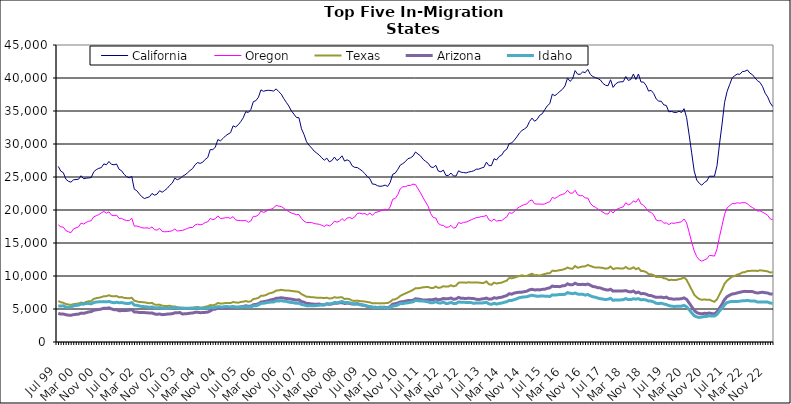
| Category | California | Oregon | Texas | Arizona | Idaho |
|---|---|---|---|---|---|
| Jul 99 | 26605 | 17749 | 6209 | 4339 | 5471 |
| Aug 99 | 25882 | 17447 | 6022 | 4228 | 5444 |
| Sep 99 | 25644 | 17401 | 5941 | 4237 | 5488 |
| Oct 99 | 24669 | 16875 | 5751 | 4134 | 5279 |
| Nov 99 | 24353 | 16701 | 5680 | 4073 | 5260 |
| Dec 99 | 24218 | 16570 | 5619 | 4042 | 5269 |
| Jan 00 | 24574 | 17109 | 5736 | 4142 | 5485 |
| Feb 00 | 24620 | 17295 | 5789 | 4192 | 5530 |
| Mar 00 | 24655 | 17436 | 5826 | 4226 | 5590 |
| Apr 00 | 25195 | 18009 | 5980 | 4375 | 5748 |
| May 00 | 24730 | 17875 | 5897 | 4337 | 5729 |
| Jun 00 | 24825 | 18113 | 6070 | 4444 | 5853 |
| Jul 00 | 24857 | 18294 | 6163 | 4555 | 5824 |
| Aug 00 | 24913 | 18376 | 6199 | 4603 | 5788 |
| Sep 00 | 25792 | 18971 | 6529 | 4804 | 5976 |
| Oct 00 | 26106 | 19135 | 6643 | 4870 | 6058 |
| Nov 00 | 26315 | 19306 | 6705 | 4926 | 6085 |
| Dec 00 | 26415 | 19570 | 6793 | 4991 | 6096 |
| Jan 01 | 26995 | 19781 | 6942 | 5122 | 6119 |
| Feb 01 | 26851 | 19519 | 6948 | 5089 | 6090 |
| Mar 01 | 27352 | 19720 | 7080 | 5180 | 6143 |
| Apr 01 | 26918 | 19221 | 6943 | 5020 | 6020 |
| May 01 | 26848 | 19126 | 6924 | 4899 | 5950 |
| Jun 01 | 26974 | 19241 | 6959 | 4895 | 6019 |
| Jul 01 | 26172 | 18725 | 6778 | 4737 | 5951 |
| Aug 01 | 25943 | 18736 | 6810 | 4757 | 5973 |
| Sep 01 | 25399 | 18514 | 6688 | 4753 | 5895 |
| Oct 01 | 25050 | 18415 | 6650 | 4780 | 5833 |
| Nov 01 | 24873 | 18381 | 6631 | 4826 | 5850 |
| Dec 01 | 25099 | 18765 | 6708 | 4898 | 5969 |
| Jan 02 | 23158 | 17561 | 6261 | 4560 | 5595 |
| Feb 02 | 22926 | 17573 | 6162 | 4531 | 5560 |
| Mar 02 | 22433 | 17452 | 6052 | 4481 | 5458 |
| Apr 02 | 22012 | 17314 | 6046 | 4458 | 5380 |
| May 02 | 21733 | 17267 | 6007 | 4452 | 5358 |
| Jun 02 | 21876 | 17298 | 5933 | 4444 | 5315 |
| Jul 02 | 21997 | 17209 | 5873 | 4383 | 5243 |
| Aug 02 | 22507 | 17436 | 5929 | 4407 | 5315 |
| Sep 02 | 22244 | 17010 | 5672 | 4248 | 5192 |
| Oct 02 | 22406 | 16952 | 5625 | 4191 | 5167 |
| Nov 02 | 22922 | 17223 | 5663 | 4242 | 5221 |
| Dec 02 | 22693 | 16770 | 5499 | 4142 | 5120 |
| Jan 03 | 22964 | 16694 | 5463 | 4166 | 5089 |
| Feb 03 | 23276 | 16727 | 5461 | 4226 | 5077 |
| Mar 03 | 23736 | 16766 | 5486 | 4251 | 5145 |
| Apr 03 | 24079 | 16859 | 5389 | 4289 | 5145 |
| May 03 | 24821 | 17117 | 5378 | 4415 | 5254 |
| Jun 03 | 24592 | 16812 | 5273 | 4426 | 5135 |
| Jul 03 | 24754 | 16875 | 5226 | 4466 | 5124 |
| Aug 03 | 25092 | 16922 | 5181 | 4244 | 5100 |
| Sep 03 | 25316 | 17036 | 5181 | 4279 | 5086 |
| Oct 03 | 25622 | 17228 | 5139 | 4301 | 5110 |
| Nov 03 | 25984 | 17335 | 5175 | 4362 | 5091 |
| Dec 03 | 26269 | 17350 | 5189 | 4396 | 5113 |
| Jan 04 | 26852 | 17734 | 5255 | 4492 | 5152 |
| Feb 04 | 27184 | 17860 | 5301 | 4502 | 5183 |
| Mar 04 | 27062 | 17757 | 5227 | 4443 | 5056 |
| Apr 04 | 27238 | 17840 | 5227 | 4461 | 5104 |
| May 04 | 27671 | 18113 | 5345 | 4493 | 5095 |
| Jun 04 | 27949 | 18201 | 5416 | 4532 | 5103 |
| Jul 04 | 29172 | 18727 | 5597 | 4697 | 5231 |
| Aug 04 | 29122 | 18529 | 5561 | 4945 | 5197 |
| Sep 04 | 29542 | 18678 | 5656 | 4976 | 5237 |
| Oct 04 | 30674 | 19108 | 5922 | 5188 | 5363 |
| Nov 04 | 30472 | 18716 | 5823 | 5106 | 5321 |
| Dec 04 | 30831 | 18755 | 5838 | 5135 | 5312 |
| Jan 05 | 31224 | 18823 | 5906 | 5155 | 5374 |
| Feb 05 | 31495 | 18842 | 5898 | 5168 | 5357 |
| Mar 05 | 31714 | 18738 | 5894 | 5212 | 5313 |
| Apr 05 | 32750 | 18998 | 6060 | 5340 | 5350 |
| May 05 | 32575 | 18504 | 5989 | 5269 | 5276 |
| Jun 05 | 32898 | 18414 | 5954 | 5252 | 5271 |
| Jul 05 | 33384 | 18395 | 6062 | 5322 | 5322 |
| Aug 05 | 33964 | 18381 | 6113 | 5375 | 5316 |
| Sep 05 | 34897 | 18426 | 6206 | 5493 | 5362 |
| Oct 05 | 34780 | 18132 | 6100 | 5408 | 5308 |
| Nov 05 | 35223 | 18332 | 6162 | 5434 | 5314 |
| Dec 05 | 36415 | 19047 | 6508 | 5658 | 5487 |
| Jan 06 | 36567 | 19032 | 6576 | 5688 | 5480 |
| Feb 06 | 37074 | 19257 | 6692 | 5792 | 5616 |
| Mar 06 | 38207 | 19845 | 6993 | 6052 | 5850 |
| Apr 06 | 37976 | 19637 | 7024 | 6101 | 5864 |
| May 06 | 38099 | 19781 | 7114 | 6178 | 5943 |
| Jun 06 | 38141 | 20061 | 7331 | 6276 | 6018 |
| Jul 06 | 38097 | 20111 | 7431 | 6399 | 6046 |
| Aug 06 | 38021 | 20333 | 7542 | 6450 | 6064 |
| Sep 06 | 38349 | 20686 | 7798 | 6627 | 6232 |
| Oct 06 | 37947 | 20591 | 7825 | 6647 | 6216 |
| Nov 06 | 37565 | 20526 | 7907 | 6707 | 6244 |
| Dec 06 | 36884 | 20272 | 7840 | 6648 | 6192 |
| Jan 07 | 36321 | 19984 | 7789 | 6597 | 6151 |
| Feb 07 | 35752 | 19752 | 7799 | 6554 | 6048 |
| Mar 07 | 35025 | 19547 | 7737 | 6487 | 5989 |
| Apr 07 | 34534 | 19412 | 7685 | 6430 | 5937 |
| May 07 | 34022 | 19296 | 7654 | 6353 | 5858 |
| Jun 07 | 33974 | 19318 | 7577 | 6390 | 5886 |
| Jul 07 | 32298 | 18677 | 7250 | 6117 | 5682 |
| Aug 07 | 31436 | 18322 | 7070 | 6034 | 5617 |
| Sep 07 | 30331 | 18087 | 6853 | 5847 | 5500 |
| Oct 07 | 29813 | 18108 | 6839 | 5821 | 5489 |
| Nov 07 | 29384 | 18105 | 6777 | 5769 | 5481 |
| Dec 07 | 28923 | 17949 | 6760 | 5733 | 5499 |
| Jan 08 | 28627 | 17890 | 6721 | 5732 | 5521 |
| Feb 08 | 28328 | 17834 | 6719 | 5749 | 5579 |
| Mar 08 | 27911 | 17680 | 6690 | 5650 | 5614 |
| Apr 08 | 27543 | 17512 | 6656 | 5612 | 5635 |
| May 08 | 27856 | 17754 | 6705 | 5774 | 5798 |
| Jun 08 | 27287 | 17589 | 6593 | 5717 | 5745 |
| Jul 08 | 27495 | 17834 | 6623 | 5761 | 5807 |
| Aug 08 | 28018 | 18309 | 6789 | 5867 | 5982 |
| Sep-08 | 27491 | 18164 | 6708 | 5864 | 5954 |
| Oct 08 | 27771 | 18291 | 6755 | 5942 | 6032 |
| Nov 08 | 28206 | 18706 | 6787 | 5970 | 6150 |
| Dec 08 | 27408 | 18353 | 6505 | 5832 | 5975 |
| Jan 09 | 27601 | 18778 | 6569 | 5890 | 5995 |
| Feb 09 | 27394 | 18863 | 6483 | 5845 | 5936 |
| Mar 09 | 26690 | 18694 | 6273 | 5751 | 5806 |
| Apr 09 | 26461 | 18943 | 6222 | 5735 | 5777 |
| May 09 | 26435 | 19470 | 6272 | 5819 | 5767 |
| Jun 09 | 26187 | 19522 | 6199 | 5700 | 5649 |
| Jul 09 | 25906 | 19408 | 6171 | 5603 | 5617 |
| Aug 09 | 25525 | 19469 | 6128 | 5533 | 5540 |
| Sep 09 | 25050 | 19249 | 6059 | 5405 | 5437 |
| Oct 09 | 24741 | 19529 | 6004 | 5349 | 5369 |
| Nov 09 | 23928 | 19187 | 5854 | 5271 | 5248 |
| Dec 09 | 23899 | 19607 | 5886 | 5261 | 5195 |
| Jan 10 | 23676 | 19703 | 5881 | 5232 | 5234 |
| Feb 10 | 23592 | 19845 | 5850 | 5272 | 5236 |
| Mar 10 | 23634 | 19946 | 5864 | 5278 | 5219 |
| Apr 10 | 23774 | 20134 | 5889 | 5257 | 5201 |
| May 10 | 23567 | 19966 | 5897 | 5172 | 5105 |
| Jun 10 | 24166 | 20464 | 6087 | 5356 | 5237 |
| Jul 10 | 25410 | 21627 | 6417 | 5742 | 5452 |
| Aug 10 | 25586 | 21744 | 6465 | 5797 | 5491 |
| Sep 10 | 26150 | 22314 | 6667 | 5907 | 5609 |
| Oct 10 | 26807 | 23219 | 6986 | 6070 | 5831 |
| Nov 10 | 27033 | 23520 | 7179 | 6100 | 5810 |
| Dec 10 | 27332 | 23551 | 7361 | 6182 | 5898 |
| Jan 11 | 27769 | 23697 | 7525 | 6276 | 5938 |
| Feb 11 | 27898 | 23718 | 7708 | 6267 | 6016 |
| Mar 11 | 28155 | 23921 | 7890 | 6330 | 6081 |
| Apr 11 | 28790 | 23847 | 8146 | 6544 | 6305 |
| May 11 | 28471 | 23215 | 8131 | 6502 | 6248 |
| Jun 11 | 28191 | 22580 | 8199 | 6445 | 6217 |
| Jul 11 | 27678 | 21867 | 8291 | 6368 | 6202 |
| Aug 11 | 27372 | 21203 | 8321 | 6356 | 6146 |
| Sep 11 | 27082 | 20570 | 8341 | 6387 | 6075 |
| Oct 11 | 26528 | 19442 | 8191 | 6402 | 5932 |
| Nov 11 | 26440 | 18872 | 8176 | 6426 | 5968 |
| Dec 11 | 26770 | 18784 | 8401 | 6533 | 6106 |
| Jan 12 | 25901 | 17963 | 8202 | 6390 | 5933 |
| Feb 12 | 25796 | 17718 | 8266 | 6456 | 5900 |
| Mar 12 | 26042 | 17647 | 8456 | 6600 | 6054 |
| Apr 12 | 25239 | 17386 | 8388 | 6534 | 5838 |
| May 12 | 25238 | 17407 | 8401 | 6558 | 5854 |
| Jun 12 | 25593 | 17673 | 8594 | 6669 | 6009 |
| Jul 12 | 25155 | 17237 | 8432 | 6474 | 5817 |
| Aug 12 | 25146 | 17391 | 8536 | 6539 | 5842 |
| Sep 12 | 25942 | 18102 | 8989 | 6759 | 6061 |
| Oct 12 | 25718 | 17953 | 9012 | 6618 | 6027 |
| Nov 12 | 25677 | 18134 | 9032 | 6611 | 6009 |
| Dec 12 | 25619 | 18166 | 8981 | 6601 | 5999 |
| Jan 13 | 25757 | 18344 | 9051 | 6627 | 5989 |
| Feb-13 | 25830 | 18512 | 9001 | 6606 | 5968 |
| Mar-13 | 25940 | 18689 | 9021 | 6577 | 5853 |
| Apr 13 | 26187 | 18844 | 9013 | 6478 | 5925 |
| May 13 | 26192 | 18884 | 9003 | 6431 | 5924 |
| Jun-13 | 26362 | 19013 | 8948 | 6508 | 5896 |
| Jul 13 | 26467 | 19037 | 8958 | 6559 | 5948 |
| Aug 13 | 27253 | 19198 | 9174 | 6655 | 6020 |
| Sep 13 | 26711 | 18501 | 8747 | 6489 | 5775 |
| Oct 13 | 26733 | 18301 | 8681 | 6511 | 5711 |
| Nov 13 | 27767 | 18620 | 8989 | 6709 | 5860 |
| Dec 13 | 27583 | 18320 | 8863 | 6637 | 5740 |
| Jan 14 | 28107 | 18409 | 8939 | 6735 | 5843 |
| Feb-14 | 28313 | 18383 | 8989 | 6779 | 5893 |
| Mar 14 | 28934 | 18696 | 9160 | 6918 | 6015 |
| Apr 14 | 29192 | 18946 | 9291 | 7036 | 6099 |
| May 14 | 30069 | 19603 | 9701 | 7314 | 6304 |
| Jun 14 | 30163 | 19487 | 9641 | 7252 | 6293 |
| Jul-14 | 30587 | 19754 | 9752 | 7415 | 6427 |
| Aug-14 | 31074 | 20201 | 9882 | 7499 | 6557 |
| Sep 14 | 31656 | 20459 | 9997 | 7536 | 6719 |
| Oct 14 | 32037 | 20663 | 10109 | 7555 | 6786 |
| Nov 14 | 32278 | 20825 | 9992 | 7628 | 6831 |
| Dec 14 | 32578 | 20918 | 10006 | 7705 | 6860 |
| Jan 15 | 33414 | 21396 | 10213 | 7906 | 7000 |
| Feb 15 | 33922 | 21518 | 10337 | 7982 | 7083 |
| Mar 15 | 33447 | 20942 | 10122 | 7891 | 7006 |
| Apr-15 | 33731 | 20893 | 10138 | 7906 | 6931 |
| May 15 | 34343 | 20902 | 10053 | 7895 | 6952 |
| Jun-15 | 34572 | 20870 | 10192 | 7973 | 6966 |
| Jul 15 | 35185 | 20916 | 10303 | 8000 | 6949 |
| Aug 15 | 35780 | 21115 | 10399 | 8126 | 6938 |
| Sep 15 | 36109 | 21246 | 10428 | 8207 | 6896 |
| Oct 15 | 37555 | 21908 | 10813 | 8477 | 7140 |
| Nov 15 | 37319 | 21750 | 10763 | 8390 | 7112 |
| Dec 15 | 37624 | 21990 | 10807 | 8395 | 7149 |
| Jan 16 | 37978 | 22248 | 10892 | 8388 | 7201 |
| Feb 16 | 38285 | 22369 | 10951 | 8508 | 7192 |
| Mar 16 | 38792 | 22506 | 11075 | 8547 | 7226 |
| Apr 16 | 39994 | 22999 | 11286 | 8815 | 7487 |
| May 16 | 39488 | 22548 | 11132 | 8673 | 7382 |
| Jun 16 | 39864 | 22556 | 11100 | 8682 | 7315 |
| Jul 16 | 41123 | 22989 | 11516 | 8903 | 7420 |
| Aug 16 | 40573 | 22333 | 11251 | 8731 | 7261 |
| Sep 16 | 40560 | 22162 | 11340 | 8692 | 7216 |
| Oct 16 | 40923 | 22172 | 11456 | 8742 | 7233 |
| Nov 16 | 40817 | 21818 | 11459 | 8685 | 7101 |
| Dec 16 | 41311 | 21815 | 11681 | 8783 | 7203 |
| Jan 17 | 40543 | 21029 | 11524 | 8609 | 6982 |
| Feb 17 | 40218 | 20613 | 11385 | 8416 | 6852 |
| Mar 17 | 40052 | 20425 | 11276 | 8354 | 6775 |
| Apr 17 | 39913 | 20147 | 11297 | 8218 | 6653 |
| May 17 | 39695 | 19910 | 11265 | 8196 | 6552 |
| Jun 17 | 39177 | 19650 | 11225 | 8034 | 6500 |
| Jul 17 | 38901 | 19419 | 11115 | 7923 | 6429 |
| Aug 17 | 38827 | 19389 | 11168 | 7867 | 6479 |
| Sep 17 | 39736 | 19936 | 11426 | 7991 | 6609 |
| Oct 17 | 38576 | 19547 | 11041 | 7708 | 6315 |
| Nov 17 | 39108 | 20013 | 11158 | 7746 | 6381 |
| Dec 17 | 39359 | 20202 | 11185 | 7743 | 6366 |
| Jan 18 | 39420 | 20362 | 11118 | 7736 | 6380 |
| Feb 18 | 39440 | 20476 | 11128 | 7741 | 6407 |
| Mar 18 | 40218 | 21106 | 11362 | 7789 | 6578 |
| Apr 18 | 39637 | 20788 | 11111 | 7642 | 6423 |
| May 18 | 39777 | 20933 | 11097 | 7591 | 6430 |
| Jun 18 | 40602 | 21381 | 11317 | 7721 | 6554 |
| Jul 18 | 39767 | 21189 | 11038 | 7445 | 6489 |
| Aug 18 | 40608 | 21729 | 11200 | 7560 | 6569 |
| Sep 18 | 39395 | 20916 | 10772 | 7318 | 6383 |
| Oct 18 | 39383 | 20724 | 10740 | 7344 | 6429 |
| Nov 18 | 38891 | 20265 | 10605 | 7255 | 6365 |
| Dec 18 | 38013 | 19741 | 10292 | 7069 | 6205 |
| Jan 19 | 38130 | 19643 | 10261 | 7032 | 6203 |
| Feb 19 | 37658 | 19237 | 10132 | 6892 | 6073 |
| Mar 19 | 36831 | 18492 | 9848 | 6766 | 5863 |
| Apr 19 | 36492 | 18349 | 9839 | 6763 | 5827 |
| May 19 | 36481 | 18407 | 9867 | 6809 | 5873 |
| Jun 19 | 35925 | 17998 | 9661 | 6698 | 5761 |
| Jul 19 | 35843 | 18049 | 9598 | 6800 | 5673 |
| Aug 19 | 34870 | 17785 | 9361 | 6577 | 5512 |
| Sep 19 | 34945 | 18038 | 9428 | 6547 | 5437 |
| Oct 19 | 34802 | 17977 | 9385 | 6483 | 5390 |
| Nov 19 | 34775 | 18072 | 9403 | 6511 | 5401 |
| Dec 19 | 34976 | 18140 | 9518 | 6521 | 5419 |
| Jan 20 | 34774 | 18209 | 9594 | 6561 | 5434 |
| Feb 20 | 35352 | 18632 | 9804 | 6682 | 5543 |
| Mar 20 | 34013 | 18041 | 9411 | 6464 | 5330 |
| Apr 20 | 31385 | 16629 | 8666 | 5922 | 4906 |
| May 20 | 28657 | 15123 | 7927 | 5355 | 4419 |
| Jun 20 | 25915 | 13817 | 7164 | 4815 | 3992 |
| Jul 20 | 24545 | 12926 | 6776 | 4457 | 3810 |
| Aug 20 | 24048 | 12443 | 6521 | 4326 | 3720 |
| Sep 20 | 23756 | 12258 | 6386 | 4266 | 3784 |
| Oct 20 | 24166 | 12429 | 6452 | 4347 | 3861 |
| Nov 20 | 24404 | 12597 | 6386 | 4324 | 3883 |
| Dec 20 | 25120 | 13122 | 6420 | 4394 | 3974 |
| Jan 21 | 25111 | 13080 | 6236 | 4304 | 3924 |
| Feb 21 | 25114 | 13015 | 6094 | 4260 | 3930 |
| Mar 21 | 26701 | 14096 | 6455 | 4567 | 4185 |
| Apr 21 | 29998 | 15978 | 7222 | 5164 | 4697 |
| May 21 | 33020 | 17641 | 7969 | 5748 | 5148 |
| Jun 21 | 36320 | 19369 | 8840 | 6450 | 5628 |
| Jul 21 | 37989 | 20320 | 9306 | 6877 | 5984 |
| Aug 21 | 39007 | 20657 | 9615 | 7094 | 6084 |
| Sep 21 | 40023 | 20974 | 9914 | 7277 | 6151 |
| Oct 21 | 40348 | 20966 | 10003 | 7327 | 6140 |
| Nov 21 | 40599 | 21096 | 10203 | 7437 | 6136 |
| Dec 21 | 40548 | 21032 | 10328 | 7532 | 6183 |
| Jan 22 | 40967 | 21106 | 10535 | 7618 | 6237 |
| Feb 22 | 41019 | 21125 | 10579 | 7673 | 6236 |
| Mar 22 | 41220 | 20949 | 10751 | 7660 | 6310 |
| Apr 22 | 40730 | 20602 | 10772 | 7661 | 6221 |
| May 22 | 40504 | 20370 | 10792 | 7636 | 6210 |
| Jun 22 | 40013 | 20127 | 10802 | 7504 | 6199 |
| Jul 22 | 39582 | 19846 | 10761 | 7419 | 6050 |
| Aug 22 | 39321 | 19865 | 10868 | 7487 | 6071 |
| Sep 22 | 38685 | 19666 | 10811 | 7536 | 6074 |
| Oct 22 | 37700 | 19450 | 10764 | 7469 | 6042 |
| Nov 22 | 37133 | 19198 | 10701 | 7425 | 6042 |
| Dec 22 | 36232 | 18659 | 10527 | 7261 | 5898 |
| Jan 23 | 35674 | 18528 | 10578 | 7263 | 5879 |